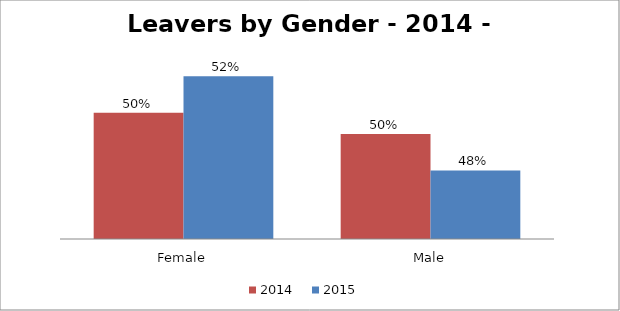
| Category | 2014
 | 2015
 |
|---|---|---|
| Female | 0.505 | 0.52 |
| Male | 0.495 | 0.48 |